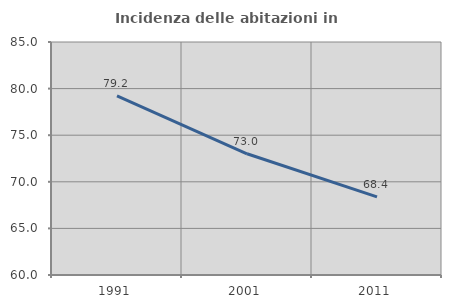
| Category | Incidenza delle abitazioni in proprietà  |
|---|---|
| 1991.0 | 79.224 |
| 2001.0 | 73.008 |
| 2011.0 | 68.378 |